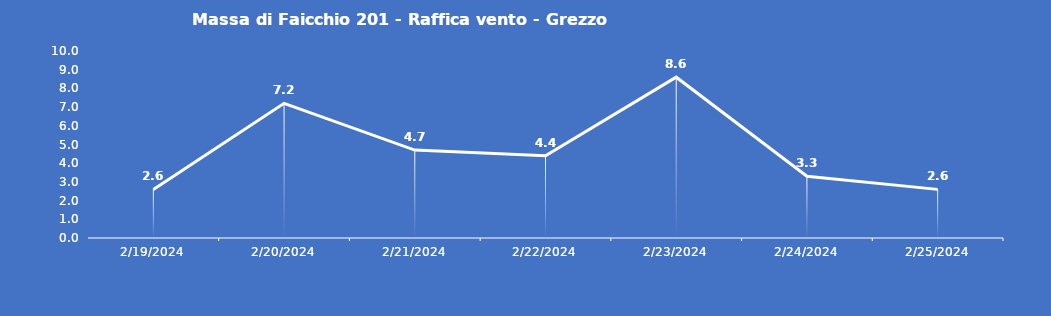
| Category | Massa di Faicchio 201 - Raffica vento - Grezzo (m/s) |
|---|---|
| 2/19/24 | 2.6 |
| 2/20/24 | 7.2 |
| 2/21/24 | 4.7 |
| 2/22/24 | 4.4 |
| 2/23/24 | 8.6 |
| 2/24/24 | 3.3 |
| 2/25/24 | 2.6 |